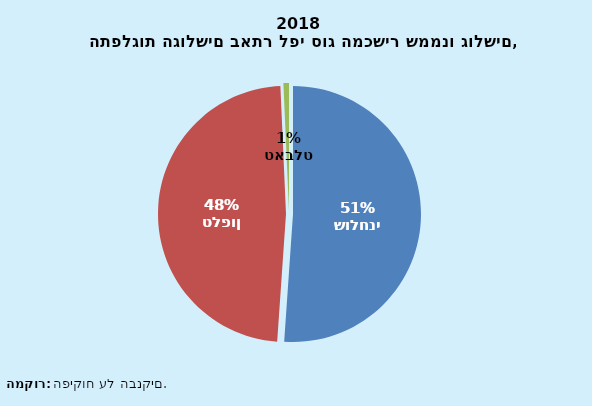
| Category | Series 0 |
|---|---|
| מחשב שולחני | 51.1 |
| טלפון | 48.2 |
| טאבלט | 0.7 |